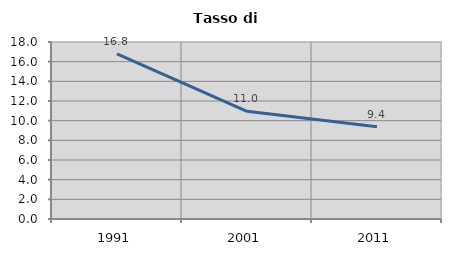
| Category | Tasso di disoccupazione   |
|---|---|
| 1991.0 | 16.789 |
| 2001.0 | 10.956 |
| 2011.0 | 9.385 |